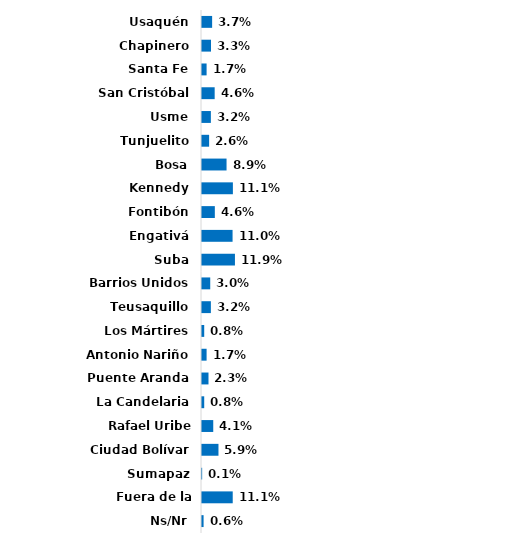
| Category | Series 0 |
|---|---|
| Usaquén | 0.037 |
| Chapinero | 0.033 |
| Santa Fe | 0.017 |
| San Cristóbal | 0.046 |
| Usme | 0.032 |
| Tunjuelito | 0.026 |
| Bosa | 0.089 |
| Kennedy | 0.111 |
| Fontibón | 0.046 |
| Engativá | 0.11 |
| Suba | 0.119 |
| Barrios Unidos | 0.03 |
| Teusaquillo | 0.032 |
| Los Mártires | 0.008 |
| Antonio Nariño | 0.017 |
| Puente Aranda | 0.023 |
| La Candelaria | 0.008 |
| Rafael Uribe Uribe | 0.041 |
| Ciudad Bolívar | 0.059 |
| Sumapaz | 0.001 |
| Fuera de la ciudad | 0.111 |
| Ns/Nr | 0.006 |